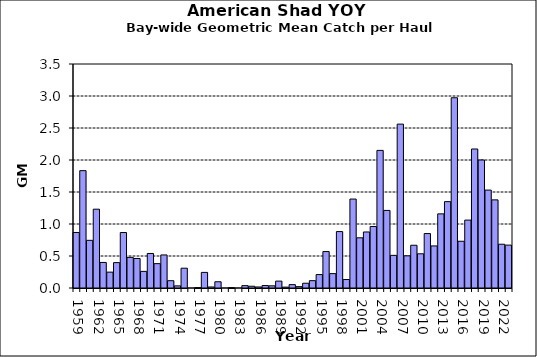
| Category | Series 0 |
|---|---|
| 1959.0 | 0.868 |
| 1960.0 | 1.834 |
| 1961.0 | 0.745 |
| 1962.0 | 1.231 |
| 1963.0 | 0.399 |
| 1964.0 | 0.248 |
| 1965.0 | 0.397 |
| 1966.0 | 0.867 |
| 1967.0 | 0.478 |
| 1968.0 | 0.461 |
| 1969.0 | 0.26 |
| 1970.0 | 0.539 |
| 1971.0 | 0.381 |
| 1972.0 | 0.516 |
| 1973.0 | 0.114 |
| 1974.0 | 0.033 |
| 1975.0 | 0.309 |
| 1976.0 | 0 |
| 1977.0 | 0.005 |
| 1978.0 | 0.244 |
| 1979.0 | 0.016 |
| 1980.0 | 0.097 |
| 1981.0 | 0 |
| 1982.0 | 0.005 |
| 1983.0 | 0 |
| 1984.0 | 0.037 |
| 1985.0 | 0.028 |
| 1986.0 | 0.016 |
| 1987.0 | 0.038 |
| 1988.0 | 0.034 |
| 1989.0 | 0.108 |
| 1990.0 | 0.014 |
| 1991.0 | 0.053 |
| 1992.0 | 0.021 |
| 1993.0 | 0.074 |
| 1994.0 | 0.115 |
| 1995.0 | 0.21 |
| 1996.0 | 0.569 |
| 1997.0 | 0.225 |
| 1998.0 | 0.882 |
| 1999.0 | 0.133 |
| 2000.0 | 1.39 |
| 2001.0 | 0.784 |
| 2002.0 | 0.875 |
| 2003.0 | 0.961 |
| 2004.0 | 2.15 |
| 2005.0 | 1.212 |
| 2006.0 | 0.51 |
| 2007.0 | 2.56 |
| 2008.0 | 0.503 |
| 2009.0 | 0.668 |
| 2010.0 | 0.535 |
| 2011.0 | 0.851 |
| 2012.0 | 0.657 |
| 2013.0 | 1.158 |
| 2014.0 | 1.35 |
| 2015.0 | 2.973 |
| 2016.0 | 0.73 |
| 2017.0 | 1.061 |
| 2018.0 | 2.172 |
| 2019.0 | 2 |
| 2020.0 | 1.53 |
| 2021.0 | 1.377 |
| 2022.0 | 0.684 |
| 2023.0 | 0.67 |